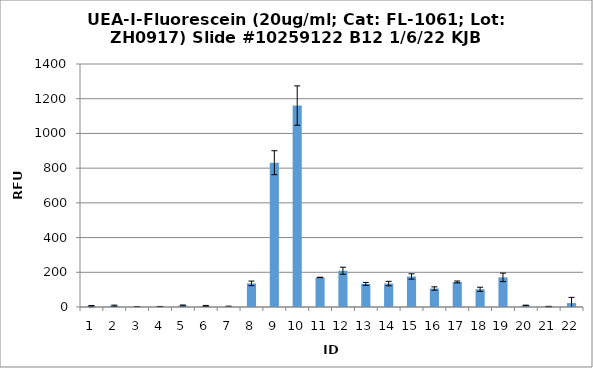
| Category | Series 0 |
|---|---|
| 0 | 5 |
| 1 | 7.25 |
| 2 | 1 |
| 3 | 2.75 |
| 4 | 8.5 |
| 5 | 6 |
| 6 | 2 |
| 7 | 136 |
| 8 | 831.25 |
| 9 | 1160.5 |
| 10 | 170.25 |
| 11 | 209 |
| 12 | 133 |
| 13 | 135 |
| 14 | 175.75 |
| 15 | 106.5 |
| 16 | 144.25 |
| 17 | 102 |
| 18 | 170.75 |
| 19 | 8.75 |
| 20 | 2.5 |
| 21 | 22.5 |